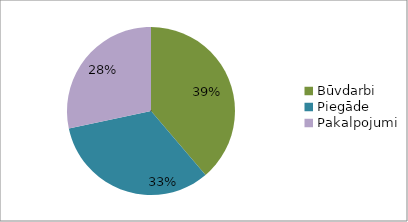
| Category | Series 0 |
|---|---|
| Būvdarbi | 0.388 |
| Piegāde | 0.329 |
| Pakalpojumi | 0.283 |